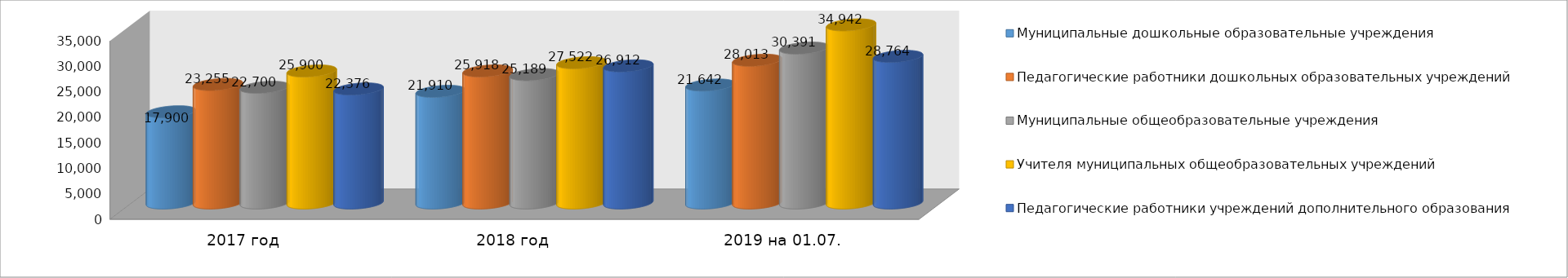
| Category | Муниципальные дошкольные образовательные учреждения | Педагогические работники дошкольных образовательных учреждений | Муниципальные общеобразовательные учреждения | Учителя муниципальных общеобразовательных учреждений | Педагогические работники учреждений дополнительного образования |
|---|---|---|---|---|---|
| 2017 год | 17900 | 23255 | 22700 | 25900 | 22376 |
| 2018 год | 21910 | 25918 | 25189 | 27522 | 26912 |
| 2019 на 01.07. | 23146 | 28013 | 30391 | 34942 | 28764 |